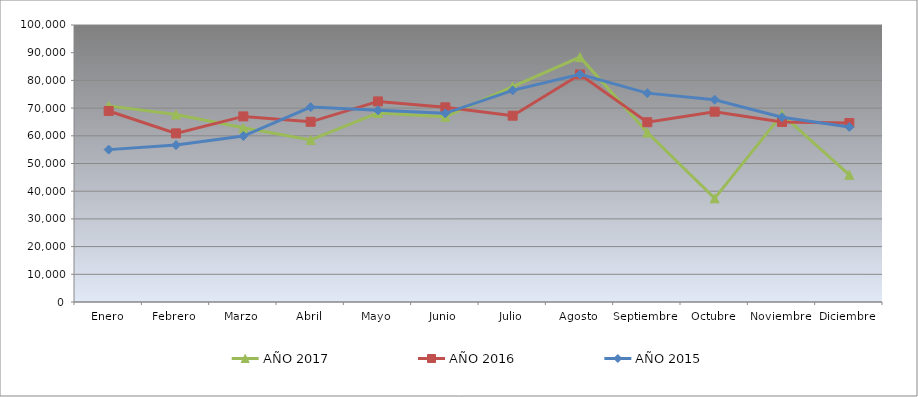
| Category | AÑO 2017 | AÑO 2016 | AÑO 2015 |
|---|---|---|---|
| Enero | 70802.511 | 68961.413 | 55009.683 |
| Febrero | 67678.522 | 60891.207 | 56651.182 |
| Marzo | 62879.909 | 67005.631 | 59916.242 |
| Abril | 58511.067 | 65049.848 | 70354.268 |
| Mayo | 68244.634 | 72414.544 | 69206.115 |
| Junio | 66890.115 | 70283.128 | 68105.802 |
| Julio | 77785.545 | 67264.615 | 76405.991 |
| Agosto | 88396.437 | 82142.848 | 82194.596 |
| Septiembre | 61172.682 | 64901.007 | 75401.357 |
| Octubre | 37419.696 | 68699.451 | 73039.272 |
| Noviembre | 67743.729 | 65002.219 | 66730.411 |
| Diciembre | 45917.302 | 64615.23 | 63184.292 |